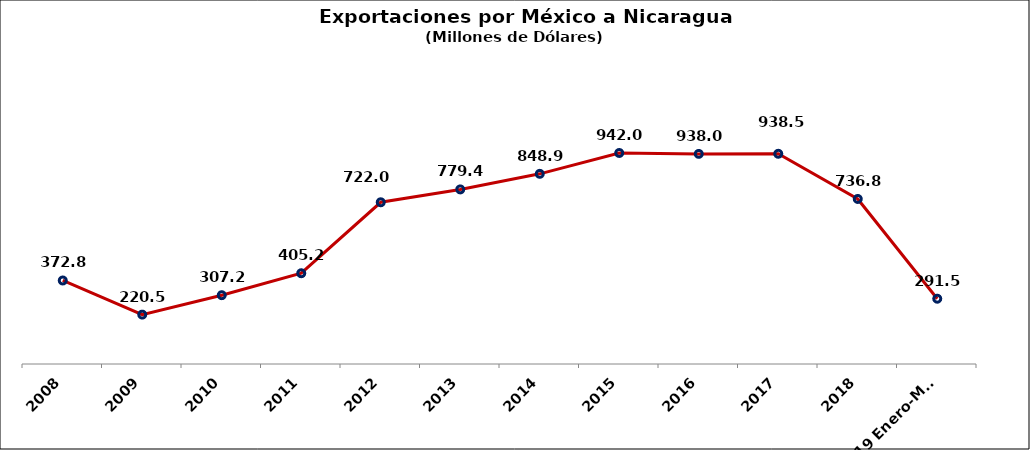
| Category | Series 0 |
|---|---|
| 2008 | 372.803 |
| 2009 | 220.479 |
| 2010 | 307.166 |
| 2011 | 405.185 |
| 2012 | 722.003 |
| 2013 | 779.407 |
| 2014 | 848.943 |
| 2015 | 942.042 |
| 2016 | 938.002 |
| 2017 | 938.5 |
| 2018 | 736.8 |
| 2019 Enero-Mayo | 291.5 |